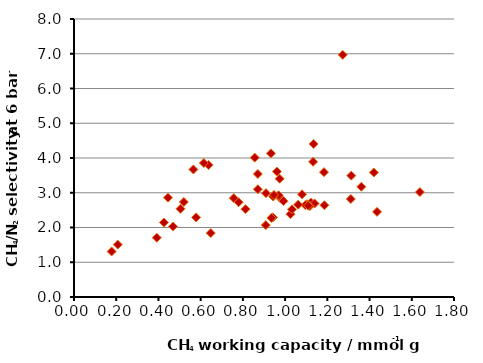
| Category | Series 0 |
|---|---|
| 1.42030553226079 | 3.583 |
| 1.186142758925418 | 2.641 |
| 0.6375834142424015 | 3.799 |
| 0.20727849388680972 | 1.508 |
| 0.4259041846510153 | 2.144 |
| 0.5785391567088378 | 2.291 |
| 0.5045338887510032 | 2.539 |
| 0.6149427185665537 | 3.855 |
| 1.1041254988823068 | 2.67 |
| 1.0254639902712315 | 2.383 |
| 1.1229663282517337 | 2.672 |
| 0.9787799841899306 | 2.833 |
| 1.1219164573554543 | 2.718 |
| 1.435532471187078 | 2.451 |
| 0.17834932335236156 | 1.31 |
| 0.8706977136081397 | 3.54 |
| 0.5655629457971201 | 3.67 |
| 0.8124862030905077 | 2.527 |
| 1.184164342960662 | 3.592 |
| 1.2731462712035517 | 6.968 |
| 1.0803205365801927 | 2.955 |
| 0.7570241149340646 | 2.846 |
| 0.9423430490988403 | 2.292 |
| 1.139646782716511 | 2.69 |
| 0.932988376428346 | 4.134 |
| 0.9692221426798615 | 2.926 |
| 0.9092621498450517 | 2.988 |
| 0.6477565603313773 | 1.84 |
| 1.3110894488015072 | 2.819 |
| 1.0958262287335798 | 2.644 |
| 0.4692700491850598 | 2.028 |
| 1.1325121138854661 | 3.89 |
| 1.134875454020142 | 4.403 |
| 1.0326931710833176 | 2.524 |
| 0.943489984708672 | 2.891 |
| 0.9351089149492622 | 2.276 |
| 0.7797590283312942 | 2.727 |
| 0.4450569773410875 | 2.857 |
| 0.9611564003719631 | 3.61 |
| 1.3137628357726323 | 3.493 |
| 0.974075006472118 | 3.404 |
| 1.638377480710294 | 3.02 |
| 0.5201343890053324 | 2.734 |
| 0.9086379181948406 | 2.069 |
| 0.9923498904447483 | 2.76 |
| 0.8708151105702597 | 3.101 |
| 1.1171199430921332 | 2.617 |
| 1.061993412026969 | 2.657 |
| 1.1095143840165473 | 2.628 |
| 1.3610925922281374 | 3.173 |
| 0.9474111307734726 | 2.936 |
| 0.39221792347241313 | 1.705 |
| 0.856145591682411 | 4.011 |